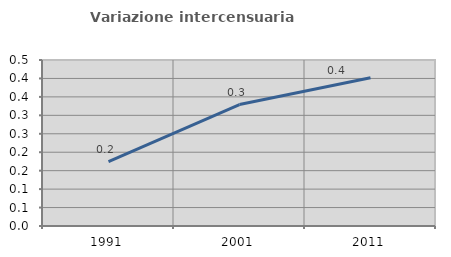
| Category | Variazione intercensuaria annua |
|---|---|
| 1991.0 | 0.175 |
| 2001.0 | 0.329 |
| 2011.0 | 0.402 |